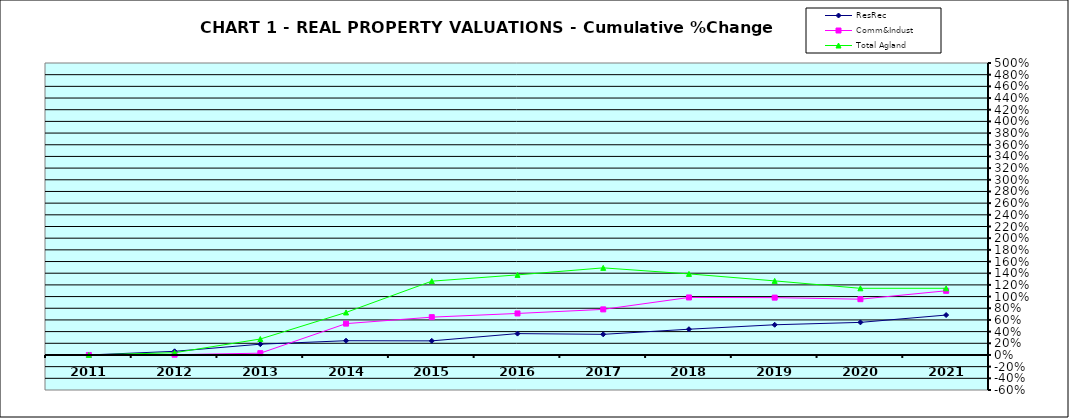
| Category | ResRec | Comm&Indust | Total Agland |
|---|---|---|---|
| 2011.0 | 0 | 0 | 0 |
| 2012.0 | 0.062 | 0.005 | 0.039 |
| 2013.0 | 0.184 | 0.031 | 0.273 |
| 2014.0 | 0.244 | 0.537 | 0.728 |
| 2015.0 | 0.241 | 0.648 | 1.264 |
| 2016.0 | 0.366 | 0.711 | 1.371 |
| 2017.0 | 0.353 | 0.781 | 1.492 |
| 2018.0 | 0.441 | 0.985 | 1.389 |
| 2019.0 | 0.517 | 0.982 | 1.269 |
| 2020.0 | 0.558 | 0.955 | 1.142 |
| 2021.0 | 0.684 | 1.099 | 1.142 |